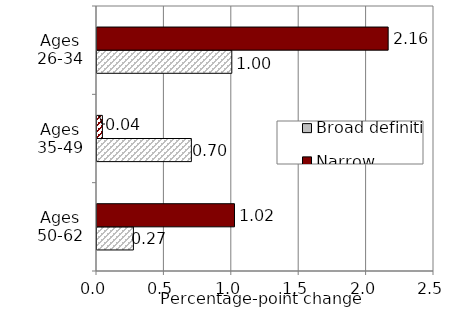
| Category | Broad definition | Narrow definition |
|---|---|---|
| Ages 50-62 | 0.27 | 1.02 |
| Ages 35-49 | 0.7 | 0.04 |
| Ages 26-34 | 1 | 2.16 |